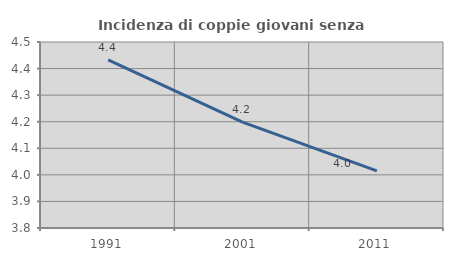
| Category | Incidenza di coppie giovani senza figli |
|---|---|
| 1991.0 | 4.433 |
| 2001.0 | 4.198 |
| 2011.0 | 4.015 |